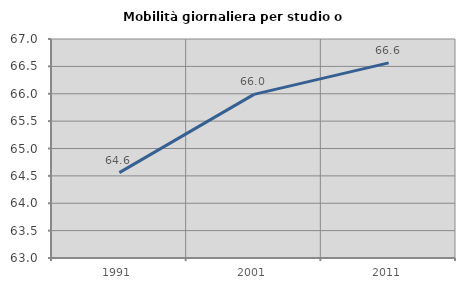
| Category | Mobilità giornaliera per studio o lavoro |
|---|---|
| 1991.0 | 64.56 |
| 2001.0 | 65.988 |
| 2011.0 | 66.564 |